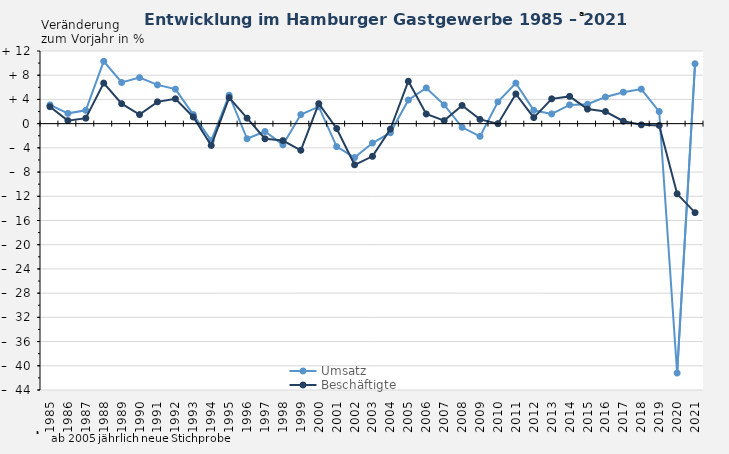
| Category | Umsatz | Beschäftigte |
|---|---|---|
| 1985.0 | 3.1 | 2.8 |
| 1986.0 | 1.7 | 0.5 |
| 1987.0 | 2.2 | 0.9 |
| 1988.0 | 10.3 | 6.7 |
| 1989.0 | 6.8 | 3.3 |
| 1990.0 | 7.6 | 1.5 |
| 1991.0 | 6.4 | 3.6 |
| 1992.0 | 5.7 | 4.1 |
| 1993.0 | 1.5 | 1.1 |
| 1994.0 | -2.8 | -3.6 |
| 1995.0 | 4.7 | 4.3 |
| 1996.0 | -2.5 | 0.9 |
| 1997.0 | -1.3 | -2.5 |
| 1998.0 | -3.5 | -2.8 |
| 1999.0 | 1.5 | -4.4 |
| 2000.0 | 2.8 | 3.3 |
| 2001.0 | -3.8 | -0.8 |
| 2002.0 | -5.6 | -6.8 |
| 2003.0 | -3.2 | -5.4 |
| 2004.0 | -1.5 | -0.9 |
| 2005.0 | 3.9 | 7 |
| 2006.0 | 5.9 | 1.6 |
| 2007.0 | 3.1 | 0.5 |
| 2008.0 | -0.6 | 3 |
| 2009.0 | -2.1 | 0.7 |
| 2010.0 | 3.6 | 0 |
| 2011.0 | 6.7 | 4.9 |
| 2012.0 | 2.2 | 1 |
| 2013.0 | 1.6 | 4.1 |
| 2014.0 | 3.1 | 4.5 |
| 2015.0 | 3.2 | 2.4 |
| 2016.0 | 4.4 | 2 |
| 2017.0 | 5.2 | 0.4 |
| 2018.0 | 5.7 | -0.2 |
| 2019.0 | 2 | -0.3 |
| 2020.0 | -41.2 | -11.6 |
| 2021.0 | 9.9 | -14.7 |